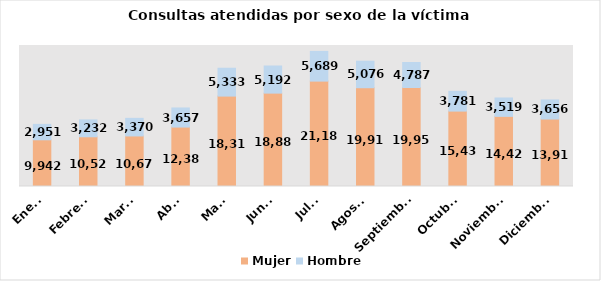
| Category | Mujer | Hombre |
|---|---|---|
| Enero | 9942 | 2951 |
| Febrero | 10521 | 3232 |
| Marzo | 10679 | 3370 |
| Abril | 12380 | 3657 |
| Mayo | 18311 | 5333 |
| Junio | 18880 | 5192 |
| Julio | 21180 | 5689 |
| Agosto | 19914 | 5076 |
| Septiembre | 19957 | 4787 |
| Octubre | 15438 | 3781 |
| Noviembre | 14429 | 3519 |
| Diciembre | 13917 | 3656 |